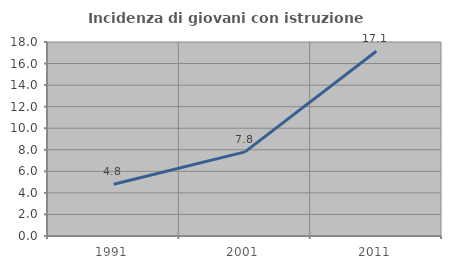
| Category | Incidenza di giovani con istruzione universitaria |
|---|---|
| 1991.0 | 4.808 |
| 2001.0 | 7.801 |
| 2011.0 | 17.143 |